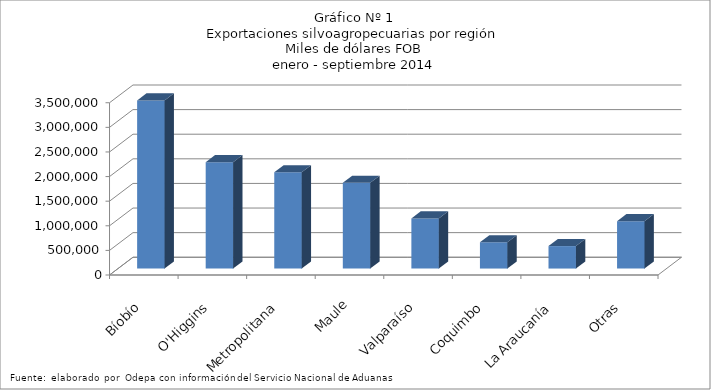
| Category | Series 0 |
|---|---|
| Bíobío | 3415797.672 |
| O'Higgins | 2160593.798 |
| Metropolitana | 1954675.108 |
| Maule | 1743080.647 |
| Valparaíso | 1019210.612 |
| Coquimbo | 534272.296 |
| La Araucanía | 456482.741 |
| Otras | 962533.91 |